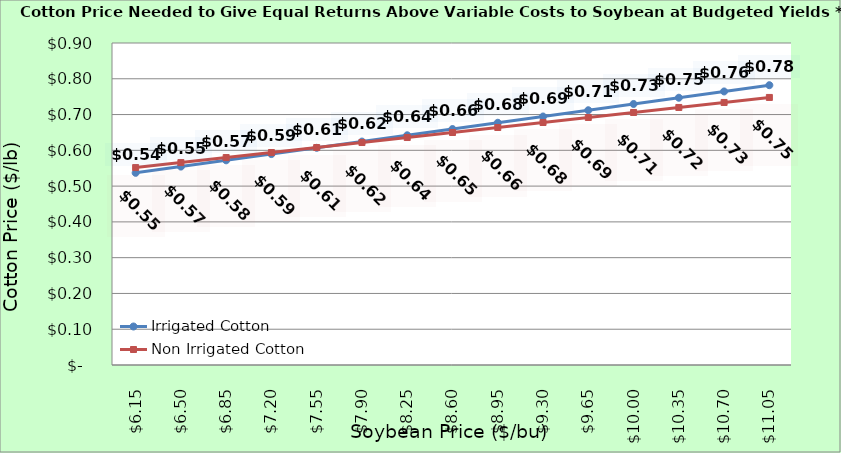
| Category | Irrigated Cotton | Non Irrigated Cotton |
|---|---|---|
| 6.150000000000002 | 0.537 | 0.552 |
| 6.500000000000002 | 0.555 | 0.566 |
| 6.850000000000001 | 0.572 | 0.58 |
| 7.200000000000001 | 0.59 | 0.594 |
| 7.550000000000001 | 0.607 | 0.608 |
| 7.9 | 0.625 | 0.622 |
| 8.25 | 0.642 | 0.636 |
| 8.6 | 0.66 | 0.65 |
| 8.95 | 0.677 | 0.664 |
| 9.299999999999999 | 0.695 | 0.678 |
| 9.649999999999999 | 0.712 | 0.692 |
| 9.999999999999998 | 0.73 | 0.706 |
| 10.349999999999998 | 0.747 | 0.72 |
| 10.699999999999998 | 0.765 | 0.734 |
| 11.049999999999997 | 0.782 | 0.748 |